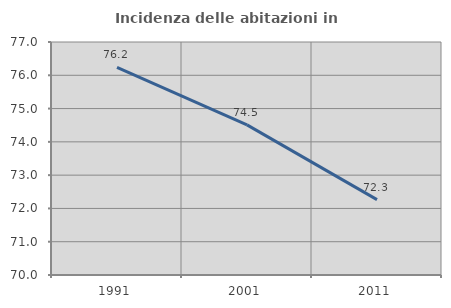
| Category | Incidenza delle abitazioni in proprietà  |
|---|---|
| 1991.0 | 76.235 |
| 2001.0 | 74.51 |
| 2011.0 | 72.266 |